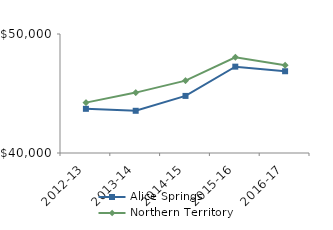
| Category | Alice Springs | Northern Territory |
|---|---|---|
| 2012-13 | 43712.5 | 44232.02 |
| 2013-14 | 43546.97 | 45075.51 |
| 2014-15 | 44797.32 | 46083.65 |
| 2015-16 | 47256 | 48046.27 |
| 2016-17 | 46871 | 47367.05 |